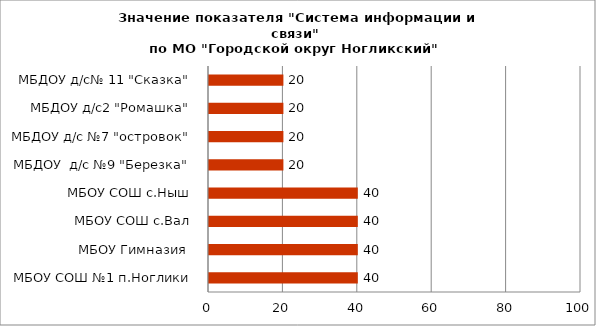
| Category | Series 0 |
|---|---|
| МБОУ СОШ №1 п.Ноглики | 40 |
| МБОУ Гимназия  | 40 |
| МБОУ СОШ с.Вал | 40 |
| МБОУ СОШ с.Ныш | 40 |
| МБДОУ  д/с №9 "Березка" | 20 |
| МБДОУ д/с №7 "островок" | 20 |
| МБДОУ д/с2 "Ромашка" | 20 |
| МБДОУ д/с№ 11 "Сказка" | 20 |